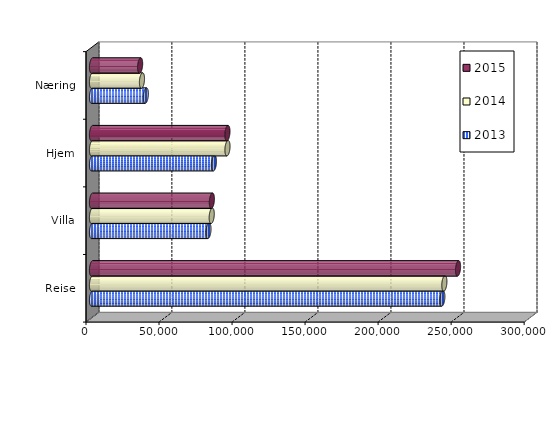
| Category | 2013 | 2014 | 2015 |
|---|---|---|---|
| Reise | 239879 | 241255 | 250627 |
| Villa | 79751 | 81975 | 82065.255 |
| Hjem | 83488 | 92758 | 92730.628 |
| Næring | 36845.404 | 34214 | 32945.626 |